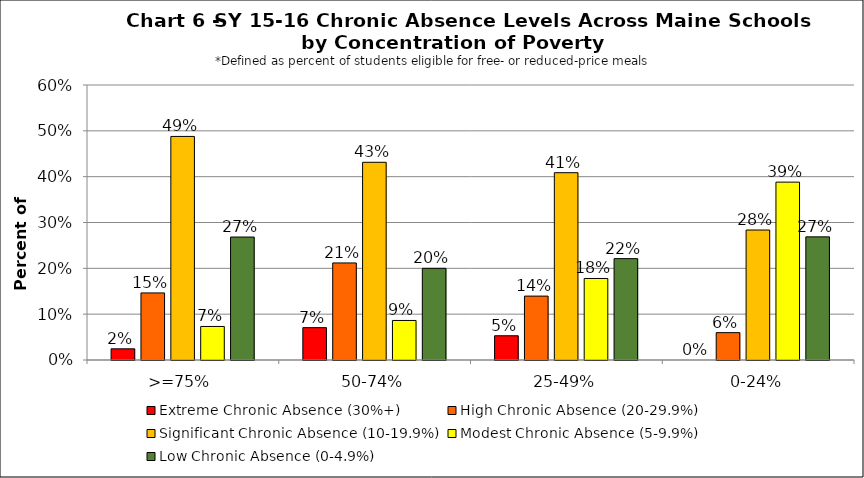
| Category | Extreme Chronic Absence (30%+) | High Chronic Absence (20-29.9%) | Significant Chronic Absence (10-19.9%) | Modest Chronic Absence (5-9.9%) | Low Chronic Absence (0-4.9%) |
|---|---|---|---|---|---|
| 0 | 0.024 | 0.146 | 0.488 | 0.073 | 0.268 |
| 1 | 0.071 | 0.212 | 0.431 | 0.086 | 0.2 |
| 2 | 0.053 | 0.139 | 0.409 | 0.178 | 0.221 |
| 3 | 0 | 0.06 | 0.284 | 0.388 | 0.269 |